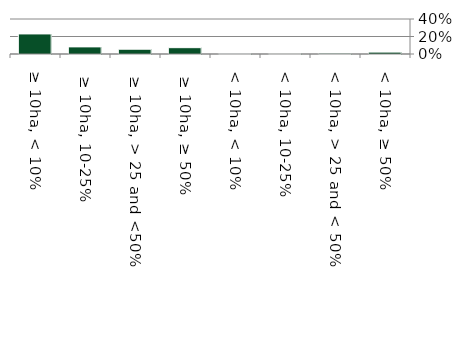
| Category | Non native |
|---|---|
|  ≥ 10ha, < 10%  | 0.229 |
|   ≥ 10ha, 10-25% | 0.081 |
|   ≥ 10ha, > 25 and <50%  | 0.055 |
|   ≥ 10ha, ≥ 50%  | 0.072 |
|  < 10ha, < 10% | 0.006 |
|  < 10ha, 10-25% | 0.005 |
|  < 10ha, > 25 and < 50% | 0.01 |
|  < 10ha, ≥ 50% | 0.021 |